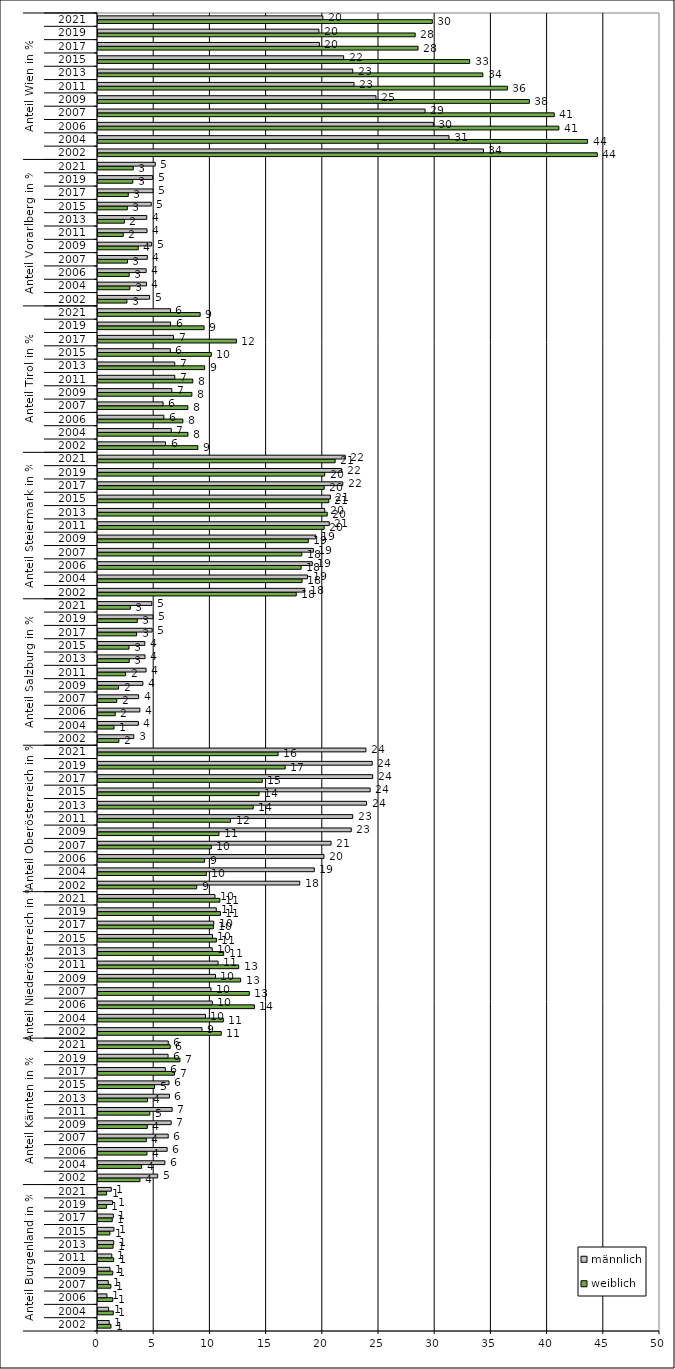
| Category | weiblich | männlich |
|---|---|---|
| 0 | 1.155 | 0.997 |
| 1 | 1.36 | 0.947 |
| 2 | 1.31 | 0.796 |
| 3 | 1.145 | 0.912 |
| 4 | 1.317 | 1.064 |
| 5 | 1.395 | 1.231 |
| 6 | 1.344 | 1.396 |
| 7 | 1.059 | 1.415 |
| 8 | 1.269 | 1.368 |
| 9 | 0.748 | 1.291 |
| 10 | 0.767 | 1.179 |
| 11 | 3.732 | 5.309 |
| 12 | 3.879 | 5.95 |
| 13 | 4.35 | 6.152 |
| 14 | 4.297 | 6.25 |
| 15 | 4.383 | 6.508 |
| 16 | 4.613 | 6.597 |
| 17 | 4.407 | 6.358 |
| 18 | 5.027 | 6.316 |
| 19 | 6.809 | 5.989 |
| 20 | 7.287 | 6.234 |
| 21 | 6.423 | 6.252 |
| 22 | 10.965 | 9.256 |
| 23 | 11.151 | 9.562 |
| 24 | 13.918 | 10.173 |
| 25 | 13.466 | 10.052 |
| 26 | 12.687 | 10.453 |
| 27 | 12.518 | 10.683 |
| 28 | 11.181 | 10.165 |
| 29 | 10.529 | 10.185 |
| 30 | 10.265 | 10.298 |
| 31 | 10.895 | 10.523 |
| 32 | 10.846 | 10.404 |
| 33 | 8.781 | 17.952 |
| 34 | 9.637 | 19.248 |
| 35 | 9.486 | 20.105 |
| 36 | 10.086 | 20.733 |
| 37 | 10.761 | 22.532 |
| 38 | 11.79 | 22.663 |
| 39 | 13.808 | 23.894 |
| 40 | 14.331 | 24.214 |
| 41 | 14.613 | 24.437 |
| 42 | 16.652 | 24.396 |
| 43 | 16.023 | 23.835 |
| 44 | 1.856 | 3.186 |
| 45 | 1.423 | 3.588 |
| 46 | 1.533 | 3.727 |
| 47 | 1.669 | 3.614 |
| 48 | 1.83 | 3.994 |
| 49 | 2.457 | 4.277 |
| 50 | 2.779 | 4.183 |
| 51 | 2.76 | 4.165 |
| 52 | 3.432 | 4.818 |
| 53 | 3.492 | 4.893 |
| 54 | 2.874 | 4.789 |
| 55 | 17.637 | 18.402 |
| 56 | 18.156 | 18.643 |
| 57 | 18.071 | 19.062 |
| 58 | 18.129 | 19.162 |
| 59 | 18.709 | 19.376 |
| 60 | 20.12 | 20.575 |
| 61 | 20.396 | 20.171 |
| 62 | 20.532 | 20.675 |
| 63 | 20.126 | 21.78 |
| 64 | 20.172 | 21.689 |
| 65 | 21.097 | 21.996 |
| 66 | 8.887 | 6.009 |
| 67 | 8.006 | 6.521 |
| 68 | 7.553 | 5.862 |
| 69 | 7.997 | 5.789 |
| 70 | 8.354 | 6.567 |
| 71 | 8.432 | 6.835 |
| 72 | 9.49 | 6.827 |
| 73 | 10.083 | 6.434 |
| 74 | 12.317 | 6.72 |
| 75 | 9.44 | 6.456 |
| 76 | 9.089 | 6.448 |
| 77 | 2.57 | 4.591 |
| 78 | 2.835 | 4.312 |
| 79 | 2.776 | 4.282 |
| 80 | 2.623 | 4.39 |
| 81 | 3.579 | 4.775 |
| 82 | 2.247 | 4.363 |
| 83 | 2.353 | 4.335 |
| 84 | 2.61 | 4.738 |
| 85 | 2.694 | 4.895 |
| 86 | 3.095 | 4.864 |
| 87 | 3.138 | 5.092 |
| 88 | 44.421 | 34.297 |
| 89 | 43.556 | 31.229 |
| 90 | 41.003 | 29.841 |
| 91 | 40.589 | 29.098 |
| 92 | 38.38 | 24.732 |
| 93 | 36.426 | 22.776 |
| 94 | 34.24 | 22.67 |
| 95 | 33.068 | 21.858 |
| 96 | 28.475 | 19.696 |
| 97 | 28.221 | 19.654 |
| 98 | 29.742 | 20.004 |